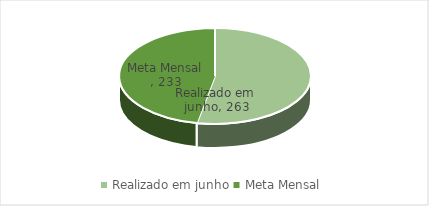
| Category | Series 0 |
|---|---|
| Realizado em junho | 263 |
| Meta Mensal  | 233 |